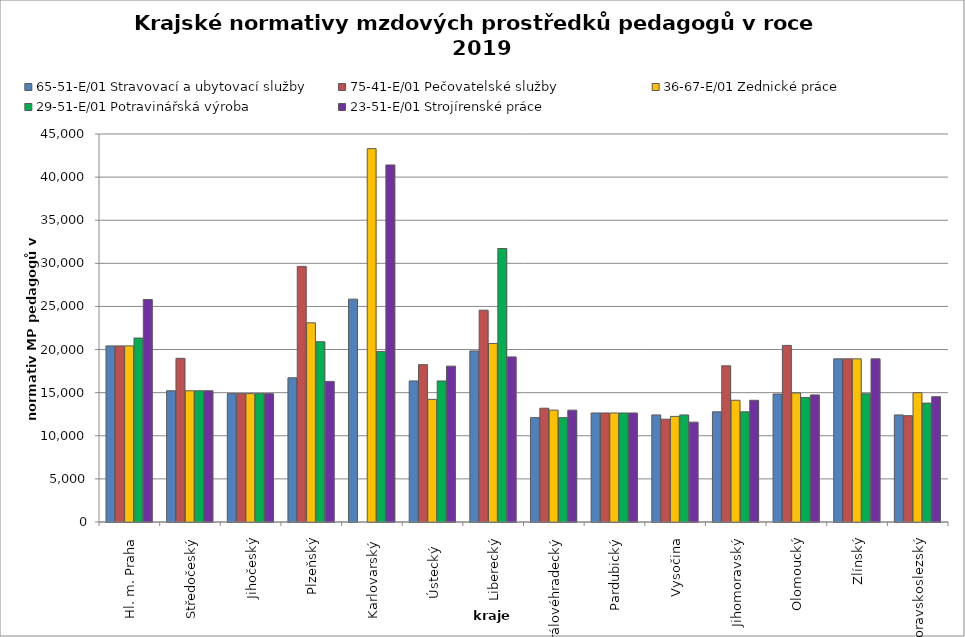
| Category | 65-51-E/01 Stravovací a ubytovací služby | 75-41-E/01 Pečovatelské služby | 36-67-E/01 Zednické práce | 29-51-E/01 Potravinářská výroba | 23-51-E/01 Strojírenské práce |
|---|---|---|---|---|---|
| Hl. m. Praha | 20425.532 | 20425.532 | 20425.532 | 21333.333 | 25806.452 |
| Středočeský | 15220.282 | 18981.472 | 15220.282 | 15220.282 | 15220.282 |
| Jihočeský | 14886.954 | 14886.954 | 14886.954 | 14886.954 | 14886.954 |
| Plzeňský | 16725.476 | 29643.527 | 23099.415 | 20908.69 | 16305.47 |
| Karlovarský  | 25848.292 | 0 | 43297.769 | 19760.956 | 41410.019 |
| Ústecký   | 16358.085 | 18249.79 | 14224.189 | 16358.085 | 18074.969 |
| Liberecký | 19837.564 | 24567.938 | 20709.085 | 31720.285 | 19148.062 |
| Královéhradecký | 12103.801 | 13196.913 | 12974.431 | 12103.801 | 12974.431 |
| Pardubický | 12643.854 | 12643.854 | 12643.854 | 12643.854 | 12643.854 |
| Vysočina | 12417.803 | 11921.002 | 12248.838 | 12417.803 | 11583.305 |
| Jihomoravský | 12777.724 | 18113.74 | 14117.71 | 12777.724 | 14117.71 |
| Olomoucký | 14842.551 | 20480.711 | 14971.058 | 14448.344 | 14738.63 |
| Zlínský | 18922.909 | 18922.909 | 18922.909 | 14868 | 18922.909 |
| Moravskoslezský | 12418.678 | 12334.549 | 14995.249 | 13789.688 | 14530.387 |